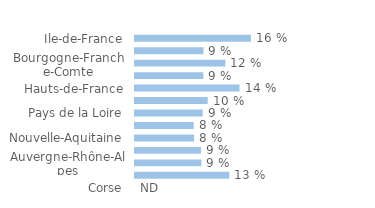
| Category | Series 0 |
|---|---|
| Ile-de-France | 0.16 |
| Centre-Val-de-Loire | 0.095 |
| Bourgogne-Franche-Comte | 0.125 |
| Normandie | 0.094 |
| Hauts-de-France | 0.144 |
| Grand-Est | 0.1 |
| Pays de la Loire | 0.094 |
| Bretagne | 0.081 |
| Nouvelle-Aquitaine | 0.082 |
| Occitanie | 0.091 |
| Auvergne-Rhône-Alpes | 0.092 |
| Provence-Alpes-Côte d'Azur | 0.13 |
| Corse | 0 |